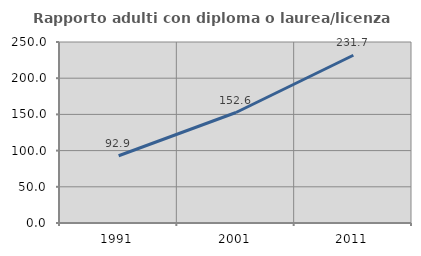
| Category | Rapporto adulti con diploma o laurea/licenza media  |
|---|---|
| 1991.0 | 92.857 |
| 2001.0 | 152.612 |
| 2011.0 | 231.667 |